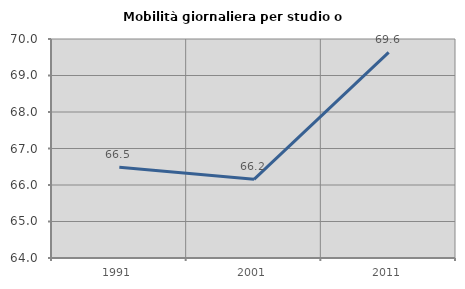
| Category | Mobilità giornaliera per studio o lavoro |
|---|---|
| 1991.0 | 66.486 |
| 2001.0 | 66.154 |
| 2011.0 | 69.634 |